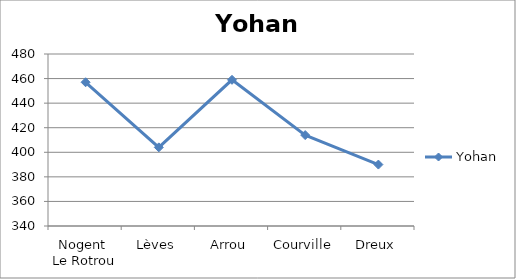
| Category | Yohan |
|---|---|
| Nogent  Le Rotrou | 457 |
| Lèves | 404 |
| Arrou | 459 |
| Courville | 414 |
| Dreux | 390 |